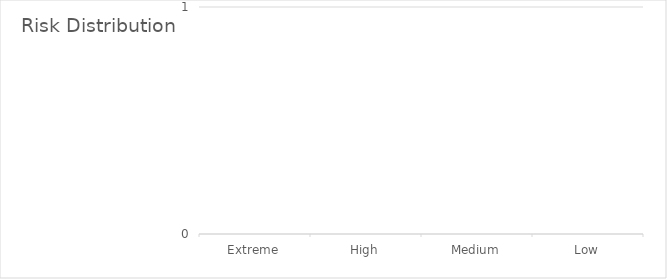
| Category | Series 0 |
|---|---|
| Extreme | 0 |
| High | 0 |
| Medium | 0 |
| Low | 0 |